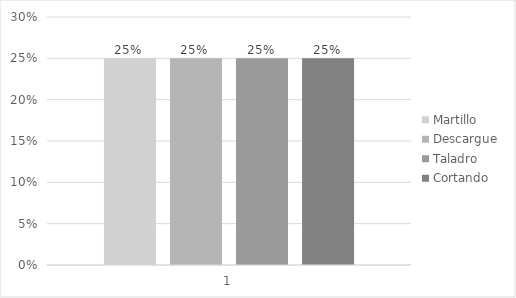
| Category | Martillo | Descargue | Taladro | Cortando |
|---|---|---|---|---|
| 0 | 0.25 | 0.25 | 0.25 | 0.25 |